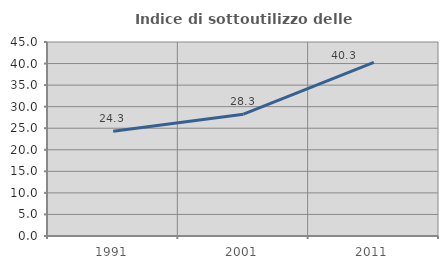
| Category | Indice di sottoutilizzo delle abitazioni  |
|---|---|
| 1991.0 | 24.316 |
| 2001.0 | 28.258 |
| 2011.0 | 40.295 |